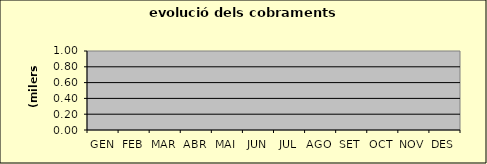
| Category | Series 0 |
|---|---|
| GEN | 0 |
| FEB | 0 |
| MAR | 0 |
| ABR | 0 |
| MAI | 0 |
| JUN | 0 |
| JUL | 0 |
| AGO | 0 |
| SET | 0 |
| OCT | 0 |
| NOV | 0 |
| DES | 0 |